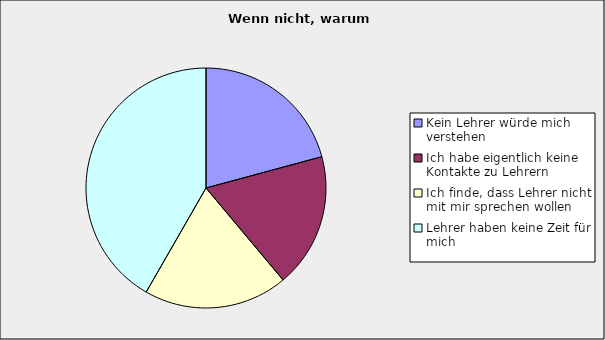
| Category | Series 0 |
|---|---|
| Kein Lehrer würde mich verstehen | 0.208 |
| Ich habe eigentlich keine Kontakte zu Lehrern | 0.181 |
| Ich finde, dass Lehrer nicht mit mir sprechen wollen | 0.194 |
| Lehrer haben keine Zeit für mich | 0.417 |